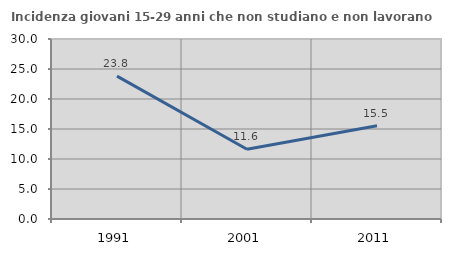
| Category | Incidenza giovani 15-29 anni che non studiano e non lavorano  |
|---|---|
| 1991.0 | 23.816 |
| 2001.0 | 11.62 |
| 2011.0 | 15.535 |